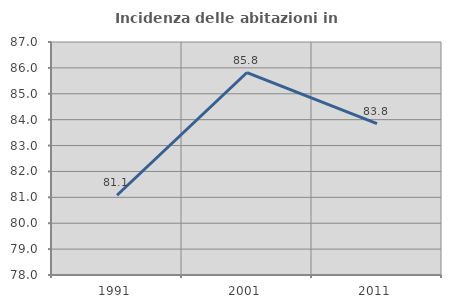
| Category | Incidenza delle abitazioni in proprietà  |
|---|---|
| 1991.0 | 81.081 |
| 2001.0 | 85.821 |
| 2011.0 | 83.846 |